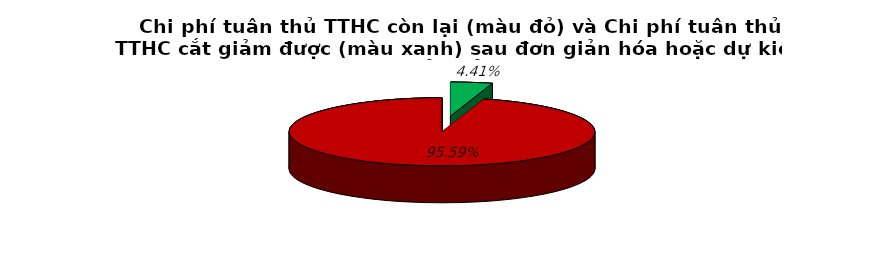
| Category | 4.4% 95.6% |
|---|---|
| 0 | 0.044 |
| 1 | 0.956 |